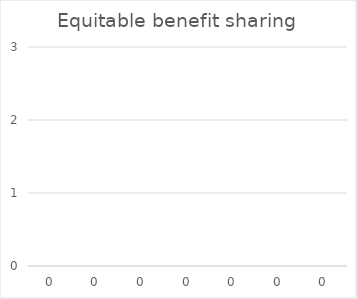
| Category | Equitable benefit sharing |
|---|---|
| 0.0 | 0 |
| 0.0 | 0 |
| 0.0 | 0 |
| 0.0 | 0 |
| 0.0 | 0 |
| 0.0 | 0 |
| 0.0 | 0 |